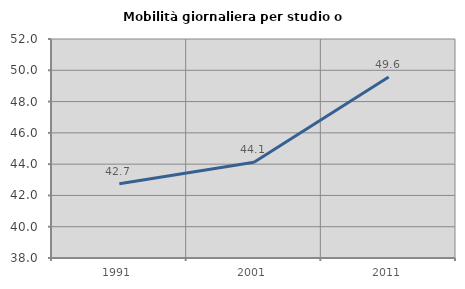
| Category | Mobilità giornaliera per studio o lavoro |
|---|---|
| 1991.0 | 42.748 |
| 2001.0 | 44.118 |
| 2011.0 | 49.565 |